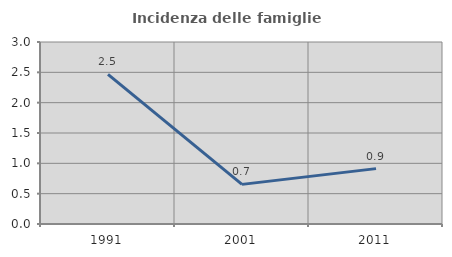
| Category | Incidenza delle famiglie numerose |
|---|---|
| 1991.0 | 2.466 |
| 2001.0 | 0.653 |
| 2011.0 | 0.913 |